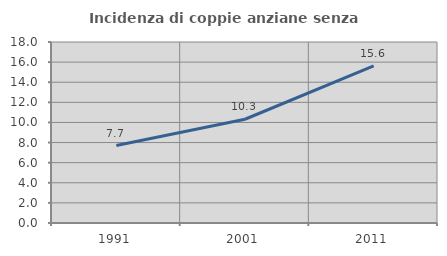
| Category | Incidenza di coppie anziane senza figli  |
|---|---|
| 1991.0 | 7.702 |
| 2001.0 | 10.317 |
| 2011.0 | 15.618 |